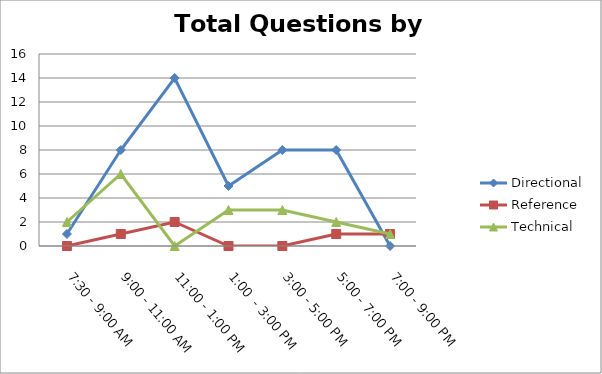
| Category | Directional | Reference | Technical |
|---|---|---|---|
| 7:30 - 9:00 AM | 1 | 0 | 2 |
| 9:00 - 11:00 AM | 8 | 1 | 6 |
| 11:00 - 1:00 PM | 14 | 2 | 0 |
| 1:00  - 3:00 PM | 5 | 0 | 3 |
| 3:00 - 5:00 PM | 8 | 0 | 3 |
| 5:00 - 7:00 PM | 8 | 1 | 2 |
| 7:00 - 9:00 PM | 0 | 1 | 1 |